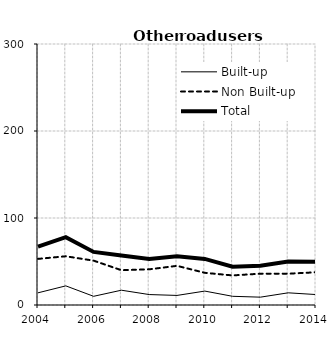
| Category | Built-up | Non Built-up | Total |
|---|---|---|---|
| 2004.0 | 14 | 53 | 67 |
| 2005.0 | 22 | 56 | 78 |
| 2006.0 | 10 | 51 | 61 |
| 2007.0 | 17 | 40 | 57 |
| 2008.0 | 12 | 41 | 53 |
| 2009.0 | 11 | 45 | 56 |
| 2010.0 | 16 | 37 | 53 |
| 2011.0 | 10 | 34 | 44 |
| 2012.0 | 9 | 36 | 45 |
| 2013.0 | 14 | 36 | 50 |
| 2014.0 | 12 | 37.6 | 49.6 |